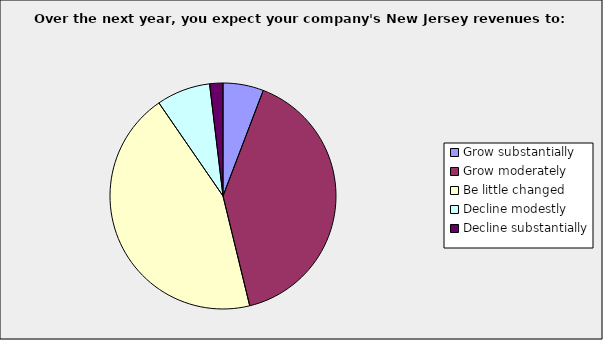
| Category | Series 0 |
|---|---|
| Grow substantially | 0.058 |
| Grow moderately | 0.404 |
| Be little changed | 0.442 |
| Decline modestly | 0.077 |
| Decline substantially | 0.019 |